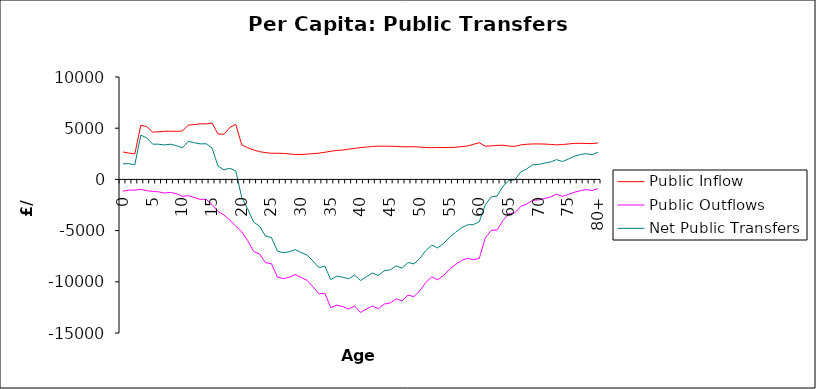
| Category | Public Inflow | Public Outflows | Net Public Transfers |
|---|---|---|---|
| 0 | 2677.446 | -1148.961 | 1528.485 |
| 1 | 2569.454 | -1037.93 | 1531.525 |
| 2 | 2488.725 | -1052.679 | 1436.046 |
| 3 | 5291.995 | -968.626 | 4323.369 |
| 4 | 5157.071 | -1101.209 | 4055.862 |
| 5 | 4616.768 | -1174.673 | 3442.095 |
| 6 | 4649.78 | -1215.733 | 3434.047 |
| 7 | 4690.754 | -1327.027 | 3363.727 |
| 8 | 4709.777 | -1272.375 | 3437.402 |
| 9 | 4690.534 | -1394.846 | 3295.688 |
| 10 | 4728.794 | -1644.055 | 3084.739 |
| 11 | 5301.873 | -1592.438 | 3709.434 |
| 12 | 5348.048 | -1766.631 | 3581.417 |
| 13 | 5422.96 | -1953.439 | 3469.52 |
| 14 | 5420.122 | -1939.349 | 3480.774 |
| 15 | 5509.953 | -2438.244 | 3071.709 |
| 16 | 4434.489 | -3132.293 | 1302.196 |
| 17 | 4409.643 | -3471.303 | 938.341 |
| 18 | 5066.09 | -3979.498 | 1086.591 |
| 19 | 5377.725 | -4556.918 | 820.808 |
| 20 | 3366.128 | -5122.616 | -1756.489 |
| 21 | 3095.81 | -5971.472 | -2875.662 |
| 22 | 2875.465 | -7044.61 | -4169.146 |
| 23 | 2712.445 | -7279.159 | -4566.714 |
| 24 | 2610.681 | -8138.028 | -5527.348 |
| 25 | 2554.07 | -8228.929 | -5674.859 |
| 26 | 2553.286 | -9537.946 | -6984.661 |
| 27 | 2538.906 | -9694.766 | -7155.86 |
| 28 | 2486.272 | -9553.809 | -7067.537 |
| 29 | 2437.58 | -9296.075 | -6858.494 |
| 30 | 2432.194 | -9571.668 | -7139.474 |
| 31 | 2470.725 | -9857.34 | -7386.615 |
| 32 | 2514.627 | -10489.872 | -7975.245 |
| 33 | 2561.181 | -11176.928 | -8615.747 |
| 34 | 2650.73 | -11125.82 | -8475.09 |
| 35 | 2747.127 | -12526.679 | -9779.553 |
| 36 | 2830.449 | -12278.747 | -9448.298 |
| 37 | 2865.961 | -12415.802 | -9549.841 |
| 38 | 2954.317 | -12662.055 | -9707.739 |
| 39 | 3021.82 | -12368.1 | -9346.28 |
| 40 | 3112.567 | -12989.537 | -9876.97 |
| 41 | 3159.204 | -12655.899 | -9496.695 |
| 42 | 3219.272 | -12365.746 | -9146.474 |
| 43 | 3246.118 | -12629.893 | -9383.776 |
| 44 | 3248.122 | -12174.898 | -8926.776 |
| 45 | 3235.533 | -12068.732 | -8833.199 |
| 46 | 3224.997 | -11669.457 | -8444.46 |
| 47 | 3186.923 | -11858.061 | -8671.139 |
| 48 | 3183.3 | -11300.261 | -8116.961 |
| 49 | 3188.103 | -11443.247 | -8255.144 |
| 50 | 3151.815 | -10872.1 | -7720.285 |
| 51 | 3117.554 | -10060.038 | -6942.485 |
| 52 | 3095.982 | -9520.518 | -6424.536 |
| 53 | 3118.792 | -9803.997 | -6685.205 |
| 54 | 3115.101 | -9371.117 | -6256.016 |
| 55 | 3114.81 | -8771.202 | -5656.391 |
| 56 | 3138.79 | -8311.877 | -5173.087 |
| 57 | 3197.809 | -7921.083 | -4723.274 |
| 58 | 3265.884 | -7709.067 | -4443.183 |
| 59 | 3419.797 | -7830.805 | -4411.008 |
| 60 | 3578.116 | -7717.034 | -4138.918 |
| 61 | 3244.151 | -5729.992 | -2485.841 |
| 62 | 3269.745 | -4982.278 | -1712.532 |
| 63 | 3318.824 | -4941.245 | -1622.421 |
| 64 | 3340.23 | -4015.662 | -675.432 |
| 65 | 3258.902 | -3365.293 | -106.391 |
| 66 | 3225.759 | -3265.555 | -39.796 |
| 67 | 3367.754 | -2630.311 | 737.443 |
| 68 | 3430.604 | -2400.937 | 1029.667 |
| 69 | 3463.049 | -2030.217 | 1432.831 |
| 70 | 3464.268 | -2006.562 | 1457.706 |
| 71 | 3449.406 | -1857.612 | 1591.794 |
| 72 | 3418.392 | -1718.551 | 1699.841 |
| 73 | 3372.347 | -1443.27 | 1929.077 |
| 74 | 3403.065 | -1654.927 | 1748.137 |
| 75 | 3461.415 | -1469.612 | 1991.803 |
| 76 | 3516.359 | -1257.054 | 2259.305 |
| 77 | 3524.645 | -1109.24 | 2415.404 |
| 78 | 3508.639 | -994.441 | 2514.198 |
| 79 | 3495.782 | -1087.106 | 2408.677 |
| 80+ | 3560.904 | -910.919 | 2649.985 |